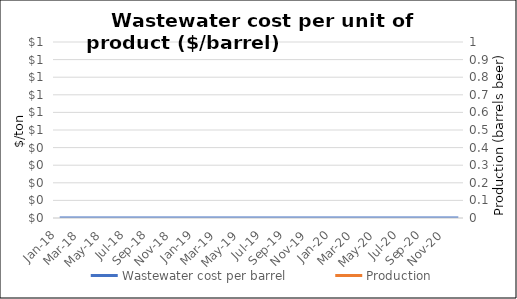
| Category | Wastewater cost per barrel |
|---|---|
| Jan-18 | 0 |
| Feb-18 | 0 |
| Mar-18 | 0 |
| Apr-18 | 0 |
| May-18 | 0 |
| Jun-18 | 0 |
| Jul-18 | 0 |
| Aug-18 | 0 |
| Sep-18 | 0 |
| Oct-18 | 0 |
| Nov-18 | 0 |
| Dec-18 | 0 |
| Jan-19 | 0 |
| Feb-19 | 0 |
| Mar-19 | 0 |
| Apr-19 | 0 |
| May-19 | 0 |
| Jun-19 | 0 |
| Jul-19 | 0 |
| Aug-19 | 0 |
| Sep-19 | 0 |
| Oct-19 | 0 |
| Nov-19 | 0 |
| Dec-19 | 0 |
| Jan-20 | 0 |
| Feb-20 | 0 |
| Mar-20 | 0 |
| Apr-20 | 0 |
| May-20 | 0 |
| Jun-20 | 0 |
| Jul-20 | 0 |
| Aug-20 | 0 |
| Sep-20 | 0 |
| Oct-20 | 0 |
| Nov-20 | 0 |
| Dec-20 | 0 |